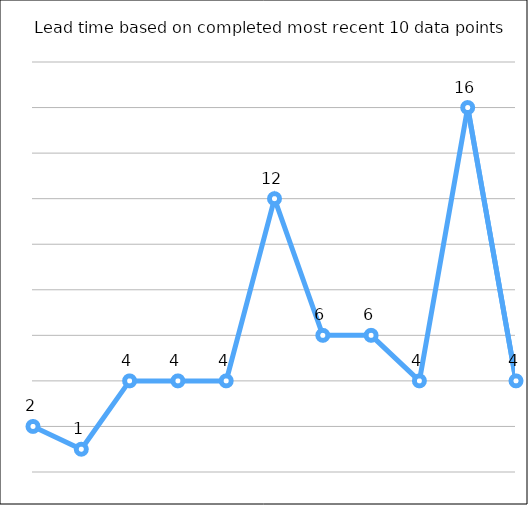
| Category | Lead time |
|---|---|
| 0 | 2 |
| 1 | 1 |
| 2 | 4 |
| 3 | 4 |
| 4 | 4 |
| 5 | 12 |
| 6 | 6 |
| 7 | 6 |
| 8 | 4 |
| 9 | 16 |
| 10 | 4 |